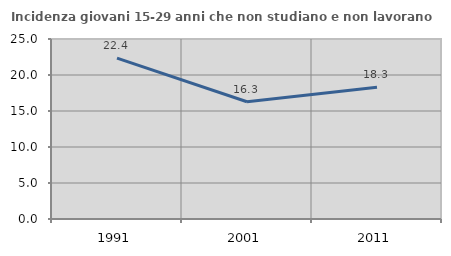
| Category | Incidenza giovani 15-29 anni che non studiano e non lavorano  |
|---|---|
| 1991.0 | 22.353 |
| 2001.0 | 16.279 |
| 2011.0 | 18.293 |